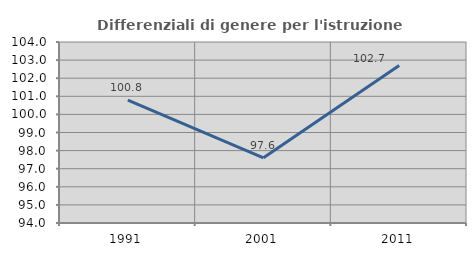
| Category | Differenziali di genere per l'istruzione superiore |
|---|---|
| 1991.0 | 100.787 |
| 2001.0 | 97.604 |
| 2011.0 | 102.704 |